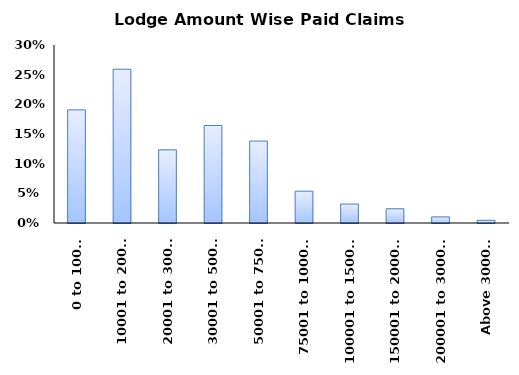
| Category | Series 0 |
|---|---|
| 0 to 10000 | 0.191 |
| 10001 to 20000 | 0.259 |
| 20001 to 30000 | 0.123 |
| 30001 to 50000 | 0.164 |
| 50001 to 75000 | 0.138 |
| 75001 to 100000 | 0.054 |
| 100001 to 150000 | 0.032 |
| 150001 to 200000 | 0.024 |
| 200001 to 300000 | 0.01 |
| Above 300000 | 0.005 |